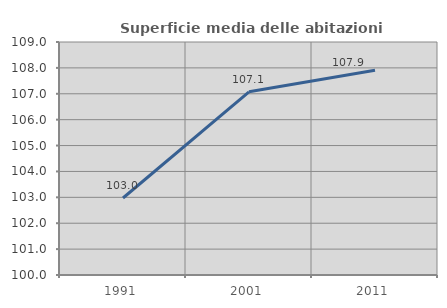
| Category | Superficie media delle abitazioni occupate |
|---|---|
| 1991.0 | 102.975 |
| 2001.0 | 107.076 |
| 2011.0 | 107.908 |